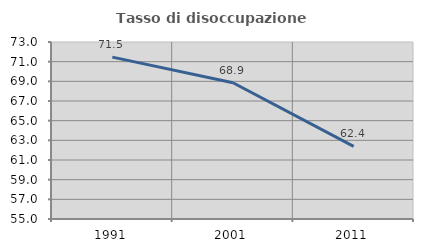
| Category | Tasso di disoccupazione giovanile  |
|---|---|
| 1991.0 | 71.464 |
| 2001.0 | 68.86 |
| 2011.0 | 62.388 |